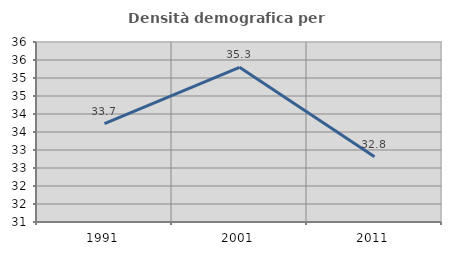
| Category | Densità demografica |
|---|---|
| 1991.0 | 33.732 |
| 2001.0 | 35.295 |
| 2011.0 | 32.81 |